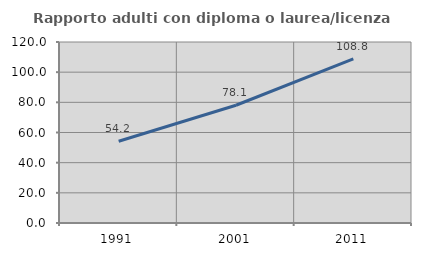
| Category | Rapporto adulti con diploma o laurea/licenza media  |
|---|---|
| 1991.0 | 54.182 |
| 2001.0 | 78.06 |
| 2011.0 | 108.787 |